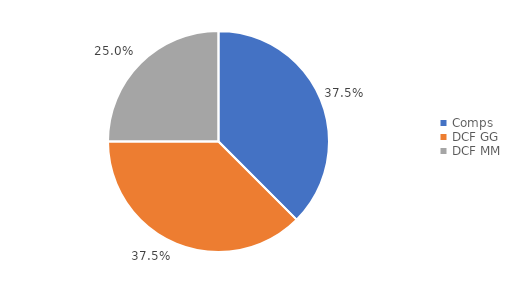
| Category | Series 0 |
|---|---|
| Comps | 0.375 |
| DCF GG | 0.375 |
| DCF MM | 0.25 |